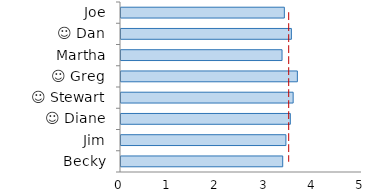
| Category | Series 0 | Series 1 |
|---|---|---|
| Joe | 3.389 | 3.5 |
|  ☺ Dan | 3.535 | 3.5 |
| Martha | 3.341 | 3.5 |
|  ☺ Greg | 3.659 | 3.5 |
|  ☺ Stewart | 3.571 | 3.5 |
|  ☺ Diane | 3.513 | 3.5 |
| Jim | 3.421 | 3.5 |
| Becky | 3.355 | 3.5 |